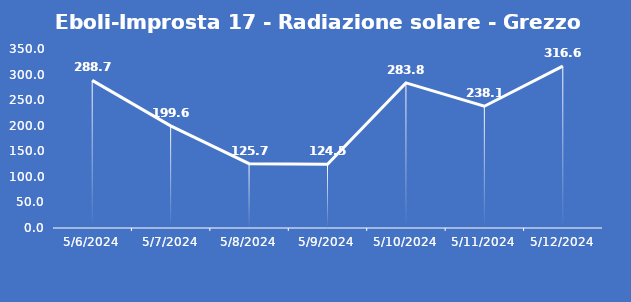
| Category | Eboli-Improsta 17 - Radiazione solare - Grezzo (W/m2) |
|---|---|
| 5/6/24 | 288.7 |
| 5/7/24 | 199.6 |
| 5/8/24 | 125.7 |
| 5/9/24 | 124.5 |
| 5/10/24 | 283.8 |
| 5/11/24 | 238.1 |
| 5/12/24 | 316.6 |